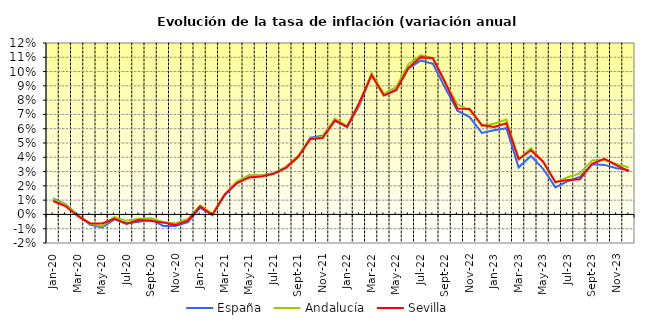
| Category | España | Andalucía | Sevilla |
|---|---|---|---|
| 2020-01-01 | 0.011 | 0.01 | 0.009 |
| 2020-02-01 | 0.007 | 0.007 | 0.006 |
| 2020-03-01 | 0 | 0 | -0.001 |
| 2020-04-01 | -0.007 | -0.006 | -0.006 |
| 2020-05-01 | -0.009 | -0.008 | -0.006 |
| 2020-06-01 | -0.003 | -0.002 | -0.003 |
| 2020-07-01 | -0.006 | -0.004 | -0.007 |
| 2020-08-01 | -0.005 | -0.003 | -0.004 |
| 2020-09-01 | -0.004 | -0.003 | -0.005 |
| 2020-10-01 | -0.008 | -0.005 | -0.006 |
| 2020-11-01 | -0.008 | -0.006 | -0.007 |
| 2020-12-01 | -0.005 | -0.003 | -0.004 |
| 2021-01-01 | 0.005 | 0.006 | 0.006 |
| 2021-02-01 | 0 | 0 | 0 |
| 2021-03-01 | 0.013 | 0.014 | 0.014 |
| 2021-04-01 | 0.022 | 0.023 | 0.022 |
| 2021-05-01 | 0.027 | 0.027 | 0.026 |
| 2021-06-01 | 0.027 | 0.027 | 0.027 |
| 2021-07-01 | 0.029 | 0.029 | 0.028 |
| 2021-08-01 | 0.033 | 0.033 | 0.033 |
| 2021-09-01 | 0.04 | 0.041 | 0.04 |
| 2021-10-01 | 0.054 | 0.053 | 0.053 |
| 2021-11-01 | 0.055 | 0.054 | 0.053 |
| 2021-12-01 | 0.065 | 0.067 | 0.066 |
| 2022-01-01 | 0.061 | 0.062 | 0.061 |
| 2022-02-01 | 0.076 | 0.078 | 0.078 |
| 2022-03-01 | 0.098 | 0.099 | 0.098 |
| 2022-04-01 | 0.083 | 0.084 | 0.083 |
| 2022-05-01 | 0.087 | 0.089 | 0.087 |
| 2022-06-01 | 0.102 | 0.105 | 0.103 |
| 2022-07-01 | 0.108 | 0.112 | 0.11 |
| 2022-08-01 | 0.105 | 0.109 | 0.109 |
| 2022-09-01 | 0.089 | 0.092 | 0.092 |
| 2022-10-01 | 0.073 | 0.077 | 0.074 |
| 2022-11-01 | 0.068 | 0.073 | 0.074 |
| 2022-12-01 | 0.057 | 0.062 | 0.063 |
| 2023-01-01 | 0.059 | 0.063 | 0.061 |
| 2023-02-01 | 0.06 | 0.066 | 0.064 |
| 2023-03-01 | 0.033 | 0.039 | 0.039 |
| 2023-04-01 | 0.041 | 0.046 | 0.045 |
| 2023-05-01 | 0.032 | 0.037 | 0.037 |
| 2023-06-01 | 0.019 | 0.022 | 0.023 |
| 2023-07-01 | 0.023 | 0.026 | 0.024 |
| 2023-08-01 | 0.026 | 0.029 | 0.025 |
| 2023-09-01 | 0.035 | 0.038 | 0.035 |
| 2023-10-01 | 0.035 | 0.038 | 0.039 |
| 2023-11-01 | 0.032 | 0.035 | 0.034 |
| 2023-12-01 | 0.031 | 0.033 | 0.03 |